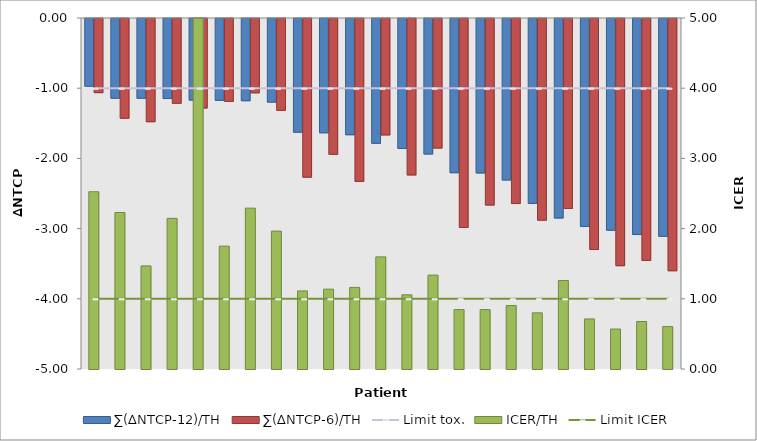
| Category | ∑(∆NTCP-12)/TH | ∑(∆NTCP-6)/TH |
|---|---|---|
| 0 | -0.965 | -1.056 |
| 1 | -1.136 | -1.421 |
| 2 | -1.136 | -1.47 |
| 3 | -1.14 | -1.208 |
| 4 | -1.162 | -1.275 |
| 5 | -1.166 | -1.18 |
| 6 | -1.171 | -1.058 |
| 7 | -1.191 | -1.309 |
| 8 | -1.62 | -2.26 |
| 9 | -1.628 | -1.935 |
| 10 | -1.655 | -2.321 |
| 11 | -1.778 | -1.658 |
| 12 | -1.852 | -2.228 |
| 13 | -1.931 | -1.846 |
| 14 | -2.196 | -2.977 |
| 15 | -2.2 | -2.657 |
| 16 | -2.301 | -2.636 |
| 17 | -2.634 | -2.873 |
| 18 | -2.842 | -2.705 |
| 19 | -2.962 | -3.29 |
| 20 | -3.016 | -3.52 |
| 21 | -3.078 | -3.446 |
| 22 | -3.103 | -3.593 |